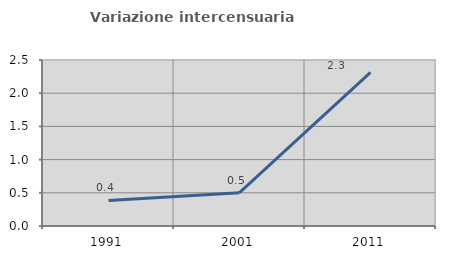
| Category | Variazione intercensuaria annua |
|---|---|
| 1991.0 | 0.385 |
| 2001.0 | 0.502 |
| 2011.0 | 2.314 |